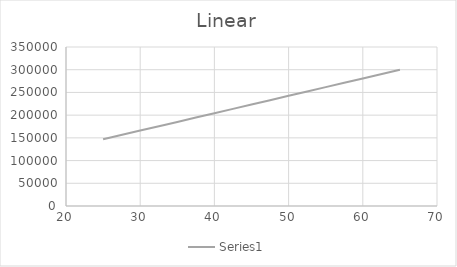
| Category | Series 2 |
|---|---|
| 25.0 | 146843.045 |
| 27.0 | 154497.656 |
| 30.0 | 165979.571 |
| 35.0 | 185116.097 |
| 40.0 | 204252.623 |
| 45.0 | 223389.149 |
| 50.0 | 242525.675 |
| 55.0 | 261662.201 |
| 60.0 | 280798.727 |
| 65.0 | 299935.253 |